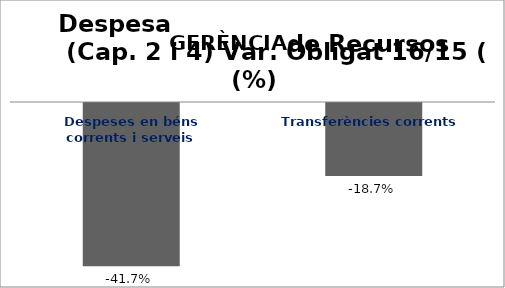
| Category | Series 0 |
|---|---|
| Despeses en béns corrents i serveis | -0.417 |
| Transferències corrents | -0.187 |